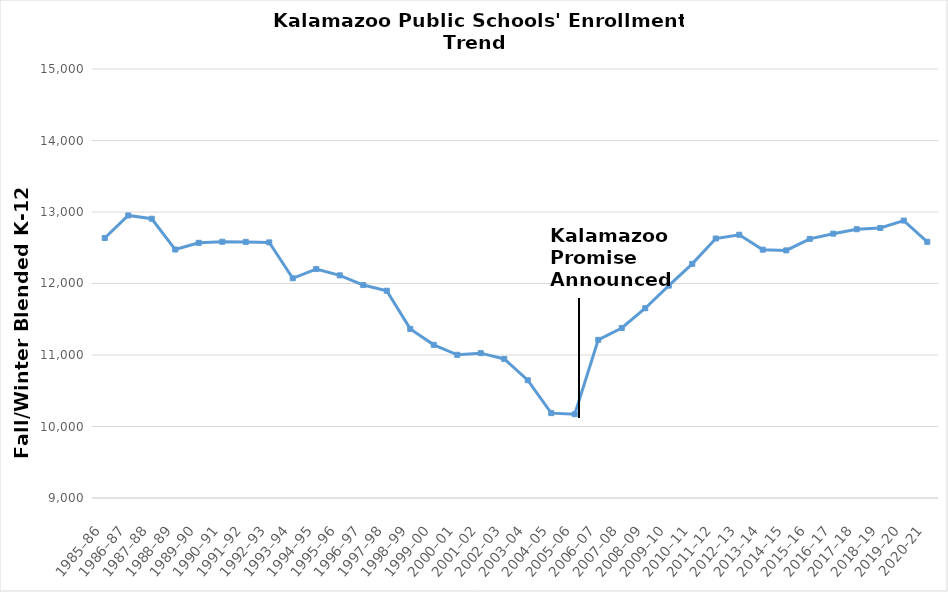
| Category | Fall/Winter Blended K-12 Headcount |
|---|---|
| 1985–86 | 12636 |
| 1986–87 | 12952 |
| 1987–88 | 12906 |
| 1988–89 | 12475 |
| 1989–90 | 12569 |
| 1990–91 | 12584 |
| 1991–92 | 12582 |
| 1992–93 | 12575 |
| 1993–94 | 12073 |
| 1994–95 | 12202 |
| 1995–96 | 12114 |
| 1996–97 | 11978 |
| 1997–98 | 11899 |
| 1998–99 | 11365 |
| 1999–00 | 11142 |
| 2000–01 | 11003 |
| 2001–02 | 11026 |
| 2002–03 | 10945 |
| 2003–04 | 10647 |
| 2004–05 | 10187 |
| 2005–06 | 10172 |
| 2006–07 | 11212 |
| 2007–08 | 11378 |
| 2008–09 | 11654 |
| 2009–10 | 11970 |
| 2010–11 | 12275 |
| 2011–12 | 12629 |
| 2012–13 | 12682 |
| 2013–14 | 12473 |
| 2014–15 | 12463 |
| 2015–16 | 12624 |
| 2016–17 | 12697 |
| 2017–18 | 12759 |
| 2018–19 | 12777 |
| 2019–20 | 12880 |
| 2020-21 | 12583 |